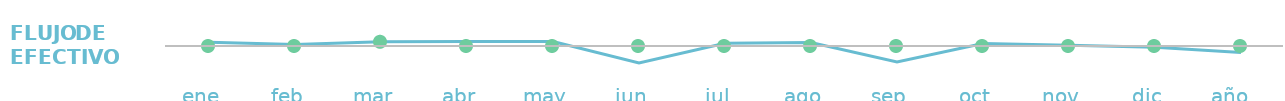
| Category | Flujo de efectivo |
|---|---|
| ene  | 169 |
| feb  | 69 |
| mar  | 192 |
| abr  | 199 |
| may  | 204 |
| jun  | -771 |
| jul  | 124 |
| ago  | 154 |
| sep  | -721 |
| oct  | 109 |
| nov  | 34 |
| dic  | -61 |
| año   | -299 |